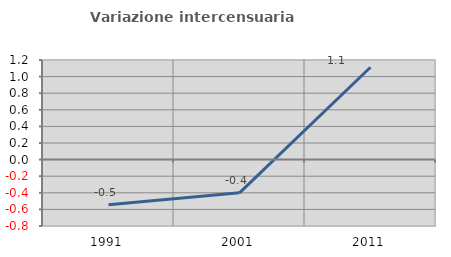
| Category | Variazione intercensuaria annua |
|---|---|
| 1991.0 | -0.545 |
| 2001.0 | -0.4 |
| 2011.0 | 1.112 |